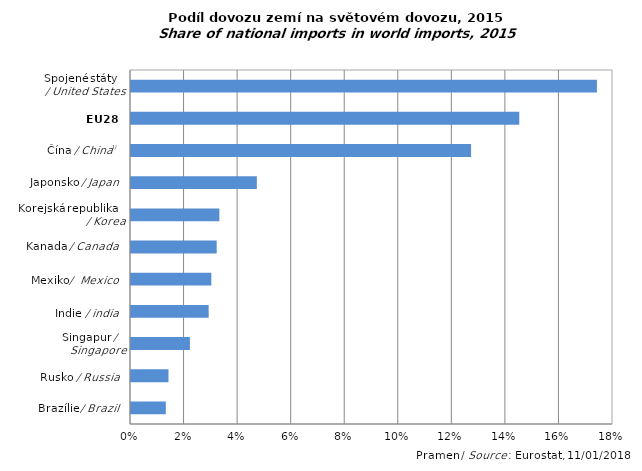
| Category | Series 0 |
|---|---|
|  | 0.013 |
|  | 0.014 |
|  | 0.022 |
|  | 0.029 |
|  | 0.03 |
|  | 0.032 |
|  | 0.033 |
|  | 0.047 |
|  | 0.127 |
|  | 0.145 |
|  | 0.174 |